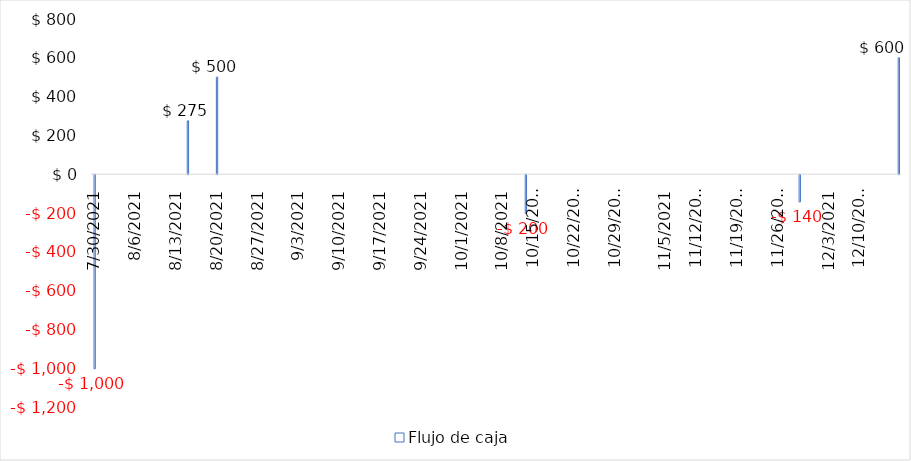
| Category |  Flujo de caja  |
|---|---|
| 7/30/21 | -1000 |
| 8/15/21 | 275 |
| 8/20/21 | 500 |
| 10/12/21 | -200 |
| 11/28/21 | -140 |
| 12/15/21 | 600 |